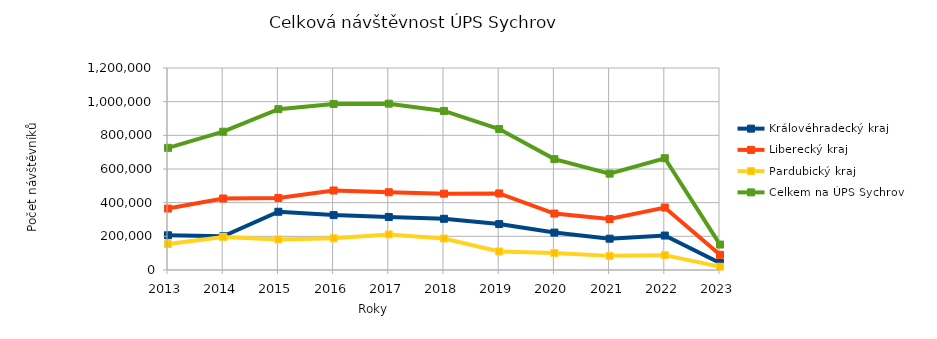
| Category | Královéhradecký kraj | Liberecký kraj | Pardubický kraj | Celkem na ÚPS Sychrov |
|---|---|---|---|---|
| 2013.0 | 206419 | 365108 | 154165 | 725692 |
| 2014.0 | 200438 | 424718 | 196473 | 821629 |
| 2015.0 | 345970 | 428023 | 181567 | 955560 |
| 2016.0 | 326137 | 472318 | 188108 | 986563 |
| 2017.0 | 314983 | 461803 | 211268 | 988054 |
| 2018.0 | 304267 | 453568 | 187017 | 944852 |
| 2019.0 | 272720 | 454785 | 109949 | 837454 |
| 2020.0 | 222238 | 335261 | 101211 | 658710 |
| 2021.0 | 185934 | 302574 | 83925 | 572433 |
| 2022.0 | 204678 | 371041 | 88282 | 664001 |
| 2023.0 | 41435 | 90390 | 19362 | 151187 |